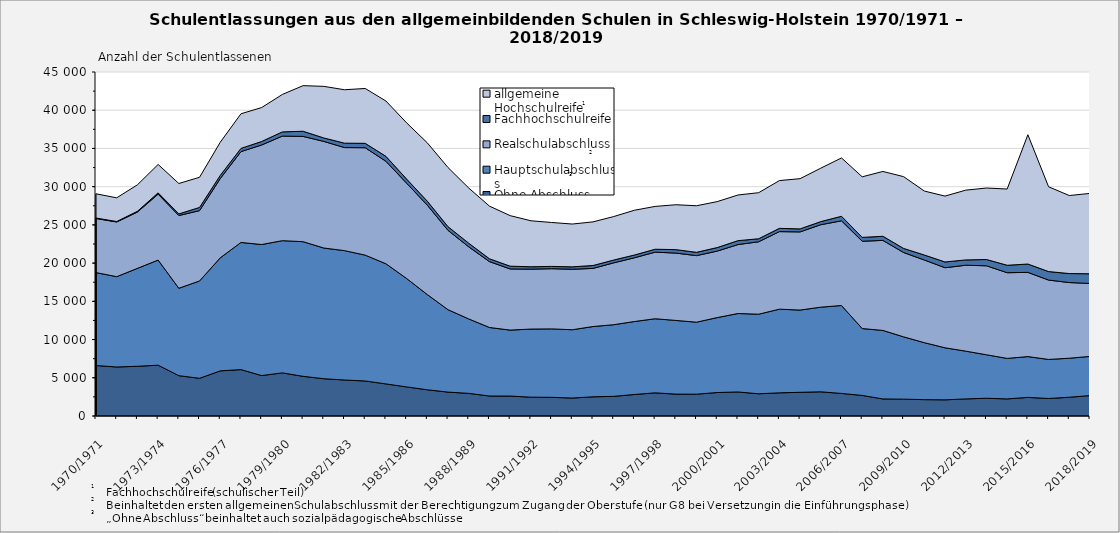
| Category | Ohne Abschluss | Hauptschulabschluss | Realschulabschluss | Fachhochschulreife | allgemeine Hochschulreife |
|---|---|---|---|---|---|
| 1970/1971 | 6600 | 12162 | 7074 | 63 | 3168 |
| 1971/1972 | 6410 | 11816 | 7157 | 58 | 3102 |
| 1972/1973 | 6504 | 12809 | 7365 | 100 | 3463 |
| 1973/1974 | 6645 | 13753 | 8626 | 168 | 3712 |
| 1974/1975 | 5277 | 11431 | 9516 | 214 | 3978 |
| 1975/1976 | 4932 | 12732 | 9201 | 414 | 3948 |
| 1976/1977 | 5904 | 14788 | 10366 | 417 | 4335 |
| 1977/1978 | 6069 | 16633 | 11883 | 422 | 4529 |
| 1978/1979 | 5288 | 17144 | 13021 | 459 | 4439 |
| 1979/1980 | 5640 | 17296 | 13681 | 549 | 4897 |
| 1980/1981 | 5190 | 17613 | 13773 | 672 | 5967 |
| 1981/1982 | 4875 | 17100 | 13946 | 454 | 6747 |
| 1982/1983 | 4710 | 16922 | 13483 | 575 | 6990 |
| 1983/1984 | 4581 | 16463 | 14051 | 574 | 7176 |
| 1984/1985 | 4199 | 15718 | 13407 | 648 | 7233 |
| 1985/1986 | 3804 | 14184 | 12462 | 546 | 7350 |
| 1986/1987 | 3429 | 12453 | 11696 | 520 | 7631 |
| 1987/1988 | 3127 | 10779 | 10378 | 479 | 7735 |
| 1988/1989 | 2960 | 9738 | 9428 | 475 | 7219 |
| 1989/1990 | 2616 | 8964 | 8617 | 372 | 6887 |
| 1990/1991 | 2610 | 8625 | 8001 | 363 | 6612 |
| 1991/1992 | 2461 | 8911 | 7836 | 313 | 6017 |
| 1992/1993 | 2441 | 8955 | 7875 | 297 | 5747 |
| 1993/1994 | 2350 | 8934 | 7911 | 315 | 5601 |
| 1994/1995 | 2511 | 9191 | 7606 | 379 | 5706 |
| 1995/1996 | 2571 | 9372 | 8094 | 363 | 5691 |
| 1996/1997 | 2813 | 9546 | 8337 | 363 | 5858 |
| 1997/1998 | 3030 | 9692 | 8713 | 379 | 5602 |
| 1998/1999 | 2863 | 9639 | 8811 | 450 | 5872 |
| 1999/2000 | 2854 | 9419 | 8706 | 431 | 6095 |
| 2000/2001 | 3072 | 9801 | 8700 | 462 | 6009 |
| 2001/2002 | 3144 | 10263 | 9018 | 510 | 5976 |
| 2002/2003 | 2907 | 10410 | 9474 | 396 | 6024 |
| 2003/2004 | 3030 | 10944 | 10146 | 426 | 6249 |
| 2004/2005 | 3099 | 10758 | 10227 | 393 | 6570 |
| 2005/2006 | 3165 | 11073 | 10785 | 405 | 6993 |
| 2006/2007 | 2952 | 11502 | 11079 | 594 | 7632 |
| 2007/2008 | 2691 | 8748 | 11424 | 501 | 7926 |
| 2008/2009 | 2232 | 8961 | 11778 | 540 | 8481 |
| 2009/2010 | 2202 | 8151 | 11031 | 537 | 9387 |
| 2010/2011 | 2142 | 7452 | 10815 | 651 | 8367 |
| 2011/2012 | 2115 | 6807 | 10473 | 756 | 8616 |
| 2012/2013 | 2238 | 6246 | 11241 | 693 | 9126 |
| 2013/2014 | 2322 | 5688 | 11640 | 822 | 9351 |
| 2014/2015 | 2235 | 5301 | 11208 | 975 | 9972 |
| 2015/2016 | 2436 | 5337 | 11016 | 1089 | 16914 |
| 2016/2017 | 2292 | 5106 | 10386 | 1110 | 11091 |
| 2017/2018 | 2454 | 5106 | 9897 | 1176 | 10209 |
| 2018/2019 | 2673 | 5121 | 9546 | 1266 | 10512 |